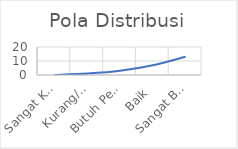
| Category | Pola Distribusi |
|---|---|
| Sangat Kurang | 0 |
| Kurang/Misconduct | 1 |
| Butuh Perbaikan | 3 |
| Baik | 7 |
| Sangat Baik | 13 |